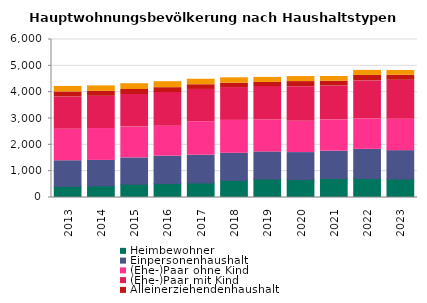
| Category | Heimbewohner | Einpersonenhaushalt | (Ehe-)Paar ohne Kind | (Ehe-)Paar mit Kind | Alleinerziehendenhaushalt | sonstiger Mehrpersonenhaushalt |
|---|---|---|---|---|---|---|
| 2013.0 | 422 | 974 | 1196 | 1226 | 191 | 209 |
| 2014.0 | 443 | 965 | 1211 | 1223 | 188 | 209 |
| 2015.0 | 506 | 998 | 1169 | 1238 | 191 | 218 |
| 2016.0 | 527 | 1043 | 1139 | 1277 | 185 | 227 |
| 2017.0 | 551 | 1052 | 1271 | 1229 | 179 | 209 |
| 2018.0 | 650 | 1028 | 1250 | 1247 | 164 | 206 |
| 2019.0 | 701 | 1031 | 1211 | 1268 | 158 | 191 |
| 2020.0 | 680 | 1025 | 1193 | 1310 | 194 | 191 |
| 2021.0 | 719 | 1040 | 1190 | 1286 | 179 | 182 |
| 2022.0 | 725 | 1103 | 1160 | 1439 | 209 | 191 |
| 2023.0 | 701 | 1079 | 1187 | 1484 | 188 | 185 |